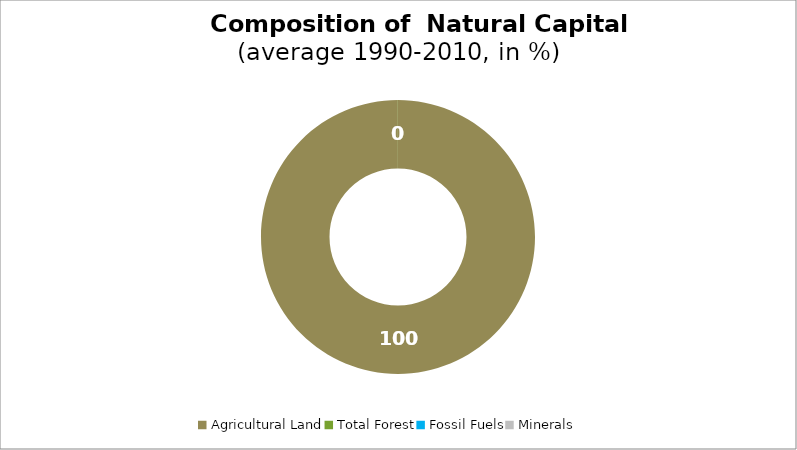
| Category | Series 0 |
|---|---|
| Agricultural Land | 99.98 |
| Total Forest | 0.02 |
| Fossil Fuels | 0 |
| Minerals | 0 |